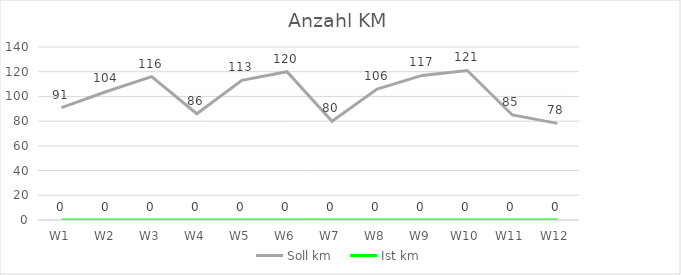
| Category | Soll km | Ist km |
|---|---|---|
| W1 | 91 | 0 |
| W2 | 104 | 0 |
| W3 | 116 | 0 |
| W4 | 86 | 0 |
| W5 | 113 | 0 |
| W6 | 120 | 0 |
| W7 | 80 | 0 |
| W8 | 106 | 0 |
| W9 | 117 | 0 |
| W10 | 121 | 0 |
| W11 | 85 | 0 |
| W12 | 78.2 | 0 |